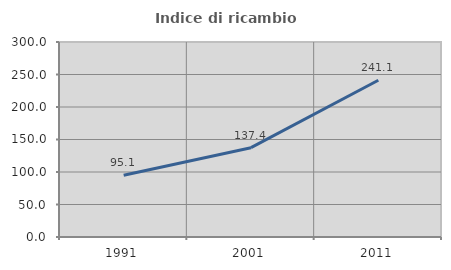
| Category | Indice di ricambio occupazionale  |
|---|---|
| 1991.0 | 95.13 |
| 2001.0 | 137.444 |
| 2011.0 | 241.121 |